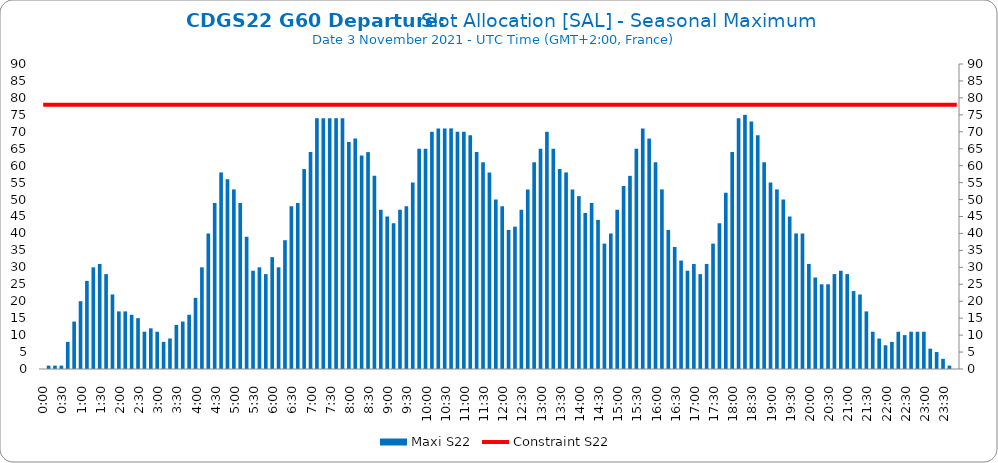
| Category | Maxi S22 |
|---|---|
| 0.0 | 0 |
| 0.006944444444444444 | 1 |
| 0.013888888888888888 | 1 |
| 0.020833333333333332 | 1 |
| 0.027777777777777776 | 8 |
| 0.034722222222222224 | 14 |
| 0.041666666666666664 | 20 |
| 0.04861111111111111 | 26 |
| 0.05555555555555555 | 30 |
| 0.0625 | 31 |
| 0.06944444444444443 | 28 |
| 0.0763888888888889 | 22 |
| 0.08333333333333333 | 17 |
| 0.09027777777777778 | 17 |
| 0.09722222222222222 | 16 |
| 0.10416666666666667 | 15 |
| 0.1111111111111111 | 11 |
| 0.11805555555555557 | 12 |
| 0.125 | 11 |
| 0.13194444444444445 | 8 |
| 0.1388888888888889 | 9 |
| 0.14583333333333334 | 13 |
| 0.15277777777777776 | 14 |
| 0.15972222222222224 | 16 |
| 0.16666666666666666 | 21 |
| 0.17361111111111113 | 30 |
| 0.18055555555555555 | 40 |
| 0.1875 | 49 |
| 0.19444444444444445 | 58 |
| 0.20138888888888887 | 56 |
| 0.20833333333333334 | 53 |
| 0.2152777777777778 | 49 |
| 0.2222222222222222 | 39 |
| 0.22916666666666666 | 29 |
| 0.23611111111111113 | 30 |
| 0.24305555555555555 | 28 |
| 0.25 | 33 |
| 0.2569444444444445 | 30 |
| 0.2638888888888889 | 38 |
| 0.2708333333333333 | 48 |
| 0.2777777777777778 | 49 |
| 0.2847222222222222 | 59 |
| 0.2916666666666667 | 64 |
| 0.2986111111111111 | 74 |
| 0.3055555555555555 | 74 |
| 0.3125 | 74 |
| 0.3194444444444445 | 74 |
| 0.3263888888888889 | 74 |
| 0.3333333333333333 | 67 |
| 0.34027777777777773 | 68 |
| 0.34722222222222227 | 63 |
| 0.3541666666666667 | 64 |
| 0.3611111111111111 | 57 |
| 0.3680555555555556 | 47 |
| 0.375 | 45 |
| 0.3819444444444444 | 43 |
| 0.3888888888888889 | 47 |
| 0.3958333333333333 | 48 |
| 0.40277777777777773 | 55 |
| 0.40972222222222227 | 65 |
| 0.4166666666666667 | 65 |
| 0.4236111111111111 | 70 |
| 0.4305555555555556 | 71 |
| 0.4375 | 71 |
| 0.4444444444444444 | 71 |
| 0.4513888888888889 | 70 |
| 0.4583333333333333 | 70 |
| 0.46527777777777773 | 69 |
| 0.47222222222222227 | 64 |
| 0.4791666666666667 | 61 |
| 0.4861111111111111 | 58 |
| 0.4930555555555556 | 50 |
| 0.5 | 48 |
| 0.5069444444444444 | 41 |
| 0.513888888888889 | 42 |
| 0.5208333333333334 | 47 |
| 0.5277777777777778 | 53 |
| 0.5347222222222222 | 61 |
| 0.5416666666666666 | 65 |
| 0.548611111111111 | 70 |
| 0.5555555555555556 | 65 |
| 0.5625 | 59 |
| 0.5694444444444444 | 58 |
| 0.576388888888889 | 53 |
| 0.5833333333333334 | 51 |
| 0.5902777777777778 | 46 |
| 0.5972222222222222 | 49 |
| 0.6041666666666666 | 44 |
| 0.611111111111111 | 37 |
| 0.6180555555555556 | 40 |
| 0.625 | 47 |
| 0.6319444444444444 | 54 |
| 0.638888888888889 | 57 |
| 0.6458333333333334 | 65 |
| 0.6527777777777778 | 71 |
| 0.6597222222222222 | 68 |
| 0.6666666666666666 | 61 |
| 0.6736111111111112 | 53 |
| 0.6805555555555555 | 41 |
| 0.6875 | 36 |
| 0.6944444444444445 | 32 |
| 0.7013888888888888 | 29 |
| 0.7083333333333334 | 31 |
| 0.7152777777777778 | 28 |
| 0.7222222222222222 | 31 |
| 0.7291666666666666 | 37 |
| 0.7361111111111112 | 43 |
| 0.7430555555555555 | 52 |
| 0.75 | 64 |
| 0.7569444444444445 | 74 |
| 0.7638888888888888 | 75 |
| 0.7708333333333334 | 73 |
| 0.7777777777777778 | 69 |
| 0.7847222222222222 | 61 |
| 0.7916666666666666 | 55 |
| 0.7986111111111112 | 53 |
| 0.8055555555555555 | 50 |
| 0.8125 | 45 |
| 0.8194444444444445 | 40 |
| 0.8263888888888888 | 40 |
| 0.8333333333333334 | 31 |
| 0.8402777777777778 | 27 |
| 0.8472222222222222 | 25 |
| 0.8541666666666666 | 25 |
| 0.8611111111111112 | 28 |
| 0.8680555555555555 | 29 |
| 0.875 | 28 |
| 0.8819444444444445 | 23 |
| 0.8888888888888888 | 22 |
| 0.8958333333333334 | 17 |
| 0.9027777777777778 | 11 |
| 0.9097222222222222 | 9 |
| 0.9166666666666666 | 7 |
| 0.9236111111111112 | 8 |
| 0.9305555555555555 | 11 |
| 0.9375 | 10 |
| 0.9444444444444445 | 11 |
| 0.9513888888888888 | 11 |
| 0.9583333333333334 | 11 |
| 0.9652777777777778 | 6 |
| 0.9722222222222222 | 5 |
| 0.9791666666666666 | 3 |
| 0.9861111111111112 | 1 |
| 0.9930555555555555 | 0 |